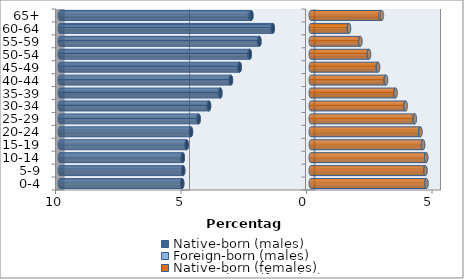
| Category | Native-born (males) | Foreign-born (males) | Native-born (females) | Foreign-born (females) |
|---|---|---|---|---|
| 0-4 | -5.119 | -0.001 | 4.607 | 0.001 |
| 5-9 | -5.081 | -0.002 | 4.567 | 0.002 |
| 10-14 | -5.097 | -0.003 | 4.596 | 0.003 |
| 15-19 | -4.942 | -0.005 | 4.472 | 0.005 |
| 20-24 | -4.771 | -0.01 | 4.361 | 0.009 |
| 25-29 | -4.466 | -0.015 | 4.132 | 0.014 |
| 30-34 | -4.053 | -0.018 | 3.764 | 0.017 |
| 35-39 | -3.599 | -0.021 | 3.364 | 0.019 |
| 40-44 | -3.18 | -0.021 | 2.984 | 0.019 |
| 45-49 | -2.829 | -0.019 | 2.669 | 0.017 |
| 50-54 | -2.428 | -0.017 | 2.311 | 0.015 |
| 55-59 | -2.045 | -0.013 | 1.967 | 0.012 |
| 60-64 | -1.513 | -0.011 | 1.518 | 0.01 |
| 65+ | -2.365 | -0.063 | 2.773 | 0.064 |